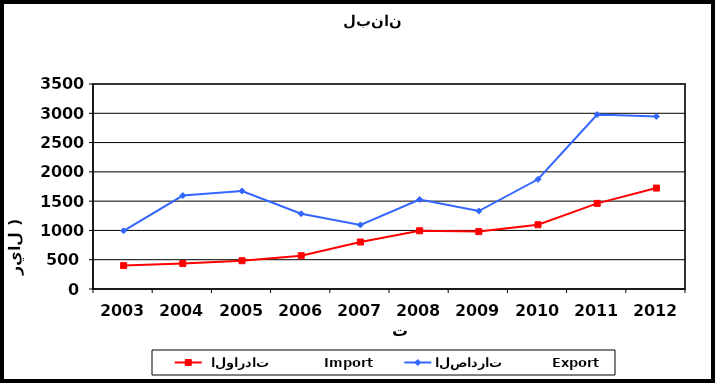
| Category |  الواردات           Import | الصادرات          Export |
|---|---|---|
| 2003.0 | 400 | 994 |
| 2004.0 | 435 | 1596 |
| 2005.0 | 483 | 1674 |
| 2006.0 | 569 | 1285 |
| 2007.0 | 802 | 1094 |
| 2008.0 | 994 | 1528 |
| 2009.0 | 980 | 1331 |
| 2010.0 | 1097 | 1873 |
| 2011.0 | 1462 | 2979 |
| 2012.0 | 1723 | 2947 |